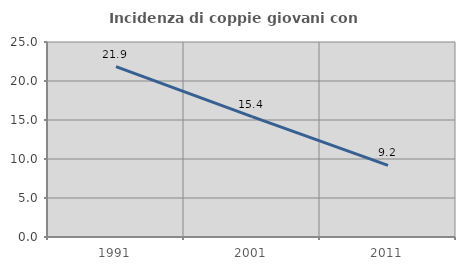
| Category | Incidenza di coppie giovani con figli |
|---|---|
| 1991.0 | 21.851 |
| 2001.0 | 15.428 |
| 2011.0 | 9.185 |